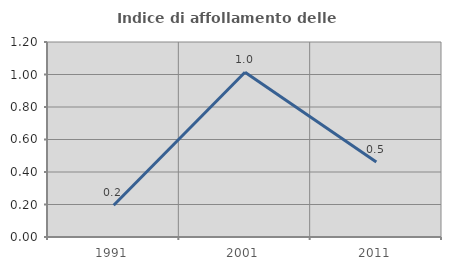
| Category | Indice di affollamento delle abitazioni  |
|---|---|
| 1991.0 | 0.195 |
| 2001.0 | 1.014 |
| 2011.0 | 0.462 |